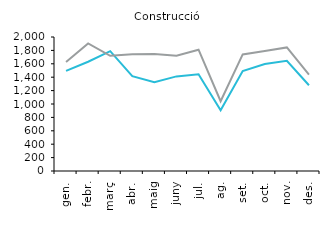
| Category | 2015 | 2016 |
|---|---|---|
| gen. | 1494 | 1627 |
| febr. | 1631 | 1903 |
| març | 1789 | 1720 |
| abr. | 1415 | 1744 |
| maig | 1325 | 1745 |
| juny | 1412 | 1722 |
| jul. | 1444 | 1811 |
| ag. | 907 | 1041 |
| set. | 1493 | 1740 |
| oct. | 1597 | 1790 |
| nov. | 1645 | 1844 |
| des. | 1280 | 1439 |